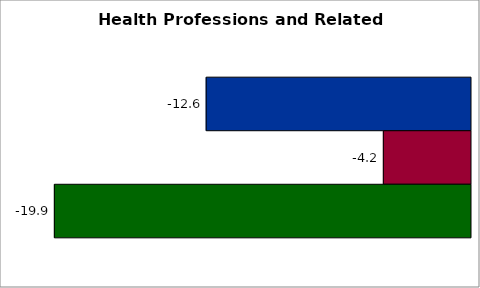
| Category | 50 states and D.C. | SREB states | State |
|---|---|---|---|
| 0 | -12.641 | -4.168 | -19.902 |